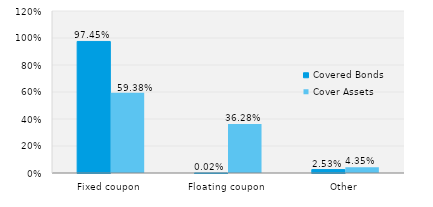
| Category | Covered Bonds | Cover Assets |
|---|---|---|
| Fixed coupon | 0.975 | 0.594 |
| Floating coupon | 0 | 0.363 |
| Other | 0.025 | 0.043 |